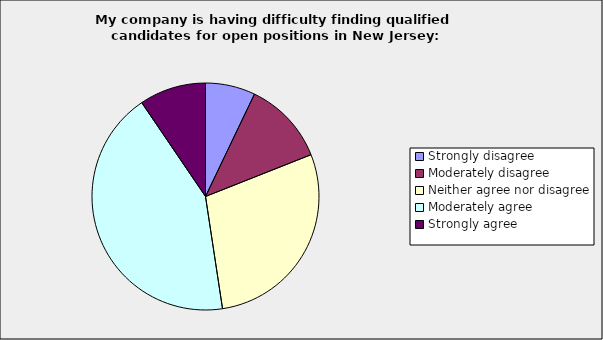
| Category | Series 0 |
|---|---|
| Strongly disagree | 0.071 |
| Moderately disagree | 0.119 |
| Neither agree nor disagree | 0.286 |
| Moderately agree | 0.429 |
| Strongly agree | 0.095 |